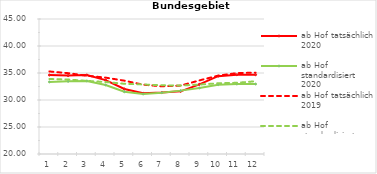
| Category | ab Hof tatsächlich 2020 | ab Hof standardisiert 2020 | ab Hof tatsächlich 2019 | ab Hof standardisiert 2019 |
|---|---|---|---|---|
| 0 | 34.621 | 33.348 | 35.286 | 33.891 |
| 1 | 34.518 | 33.453 | 34.969 | 33.787 |
| 2 | 34.628 | 33.535 | 34.493 | 33.543 |
| 3 | 33.677 | 32.789 | 34.142 | 33.326 |
| 4 | 32.039 | 31.533 | 33.578 | 33.002 |
| 5 | 31.246 | 31.111 | 32.835 | 32.878 |
| 6 | 31.379 | 31.356 | 32.534 | 32.726 |
| 7 | 31.6 | 31.735 | 32.668 | 32.68 |
| 8 | 32.897 | 32.223 | 33.627 | 32.855 |
| 9 | 34.413 | 32.83 | 34.51 | 33.096 |
| 10 | 34.683 | 32.957 | 34.979 | 33.185 |
| 11 | 34.679 | 32.955 | 35.065 | 33.475 |